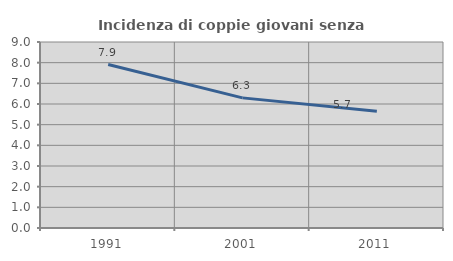
| Category | Incidenza di coppie giovani senza figli |
|---|---|
| 1991.0 | 7.91 |
| 2001.0 | 6.296 |
| 2011.0 | 5.655 |